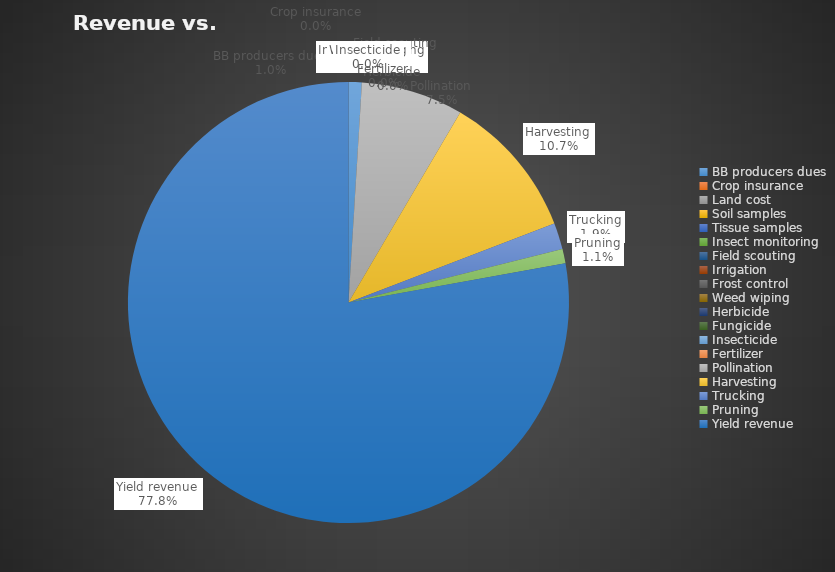
| Category | Series 0 |
|---|---|
| BB producers dues | 650 |
| Crop insurance | 0 |
| Land cost | 0 |
| Soil samples | 0 |
| Tissue samples | 0 |
| Insect monitoring | 0 |
| Field scouting | 0 |
| Irrigation | 0 |
| Frost control | 0 |
| Weed wiping | 0 |
| Herbicide | 0 |
| Fungicide | 0 |
| Insecticide | 0 |
| Fertilizer | 0 |
| Pollination | 5000 |
| Harvesting | 7150 |
| Trucking | 1300 |
| Pruning | 700 |
| Yield revenue | 52000 |